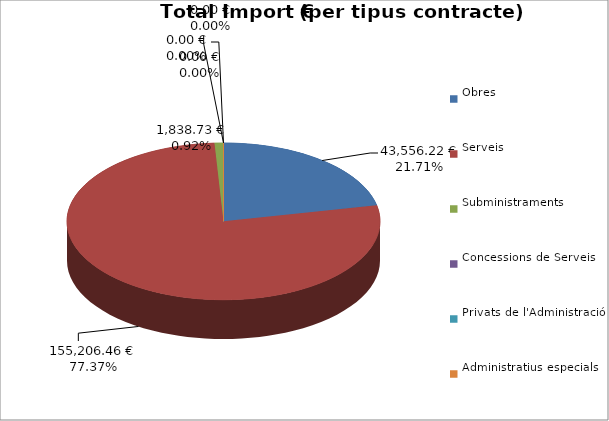
| Category | Total preu
(amb IVA) |
|---|---|
| Obres | 43556.22 |
| Serveis | 155206.455 |
| Subministraments | 1838.73 |
| Concessions de Serveis | 0 |
| Privats de l'Administració | 0 |
| Administratius especials | 0 |